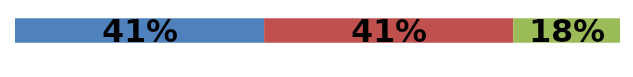
| Category | Series 0 | Series 1 | Series 2 |
|---|---|---|---|
| 0 | 0.412 | 0.412 | 0.176 |